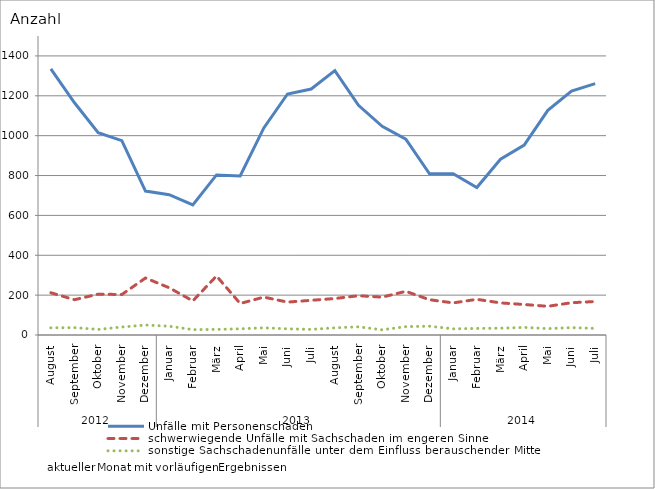
| Category | Unfälle mit Personenschaden | schwerwiegende Unfälle mit Sachschaden im engeren Sinne | sonstige Sachschadenunfälle unter dem Einfluss berauschender Mittel |
|---|---|---|---|
| 0 | 1335 | 212 | 36 |
| 1 | 1165 | 177 | 37 |
| 2 | 1015 | 205 | 28 |
| 3 | 975 | 203 | 40 |
| 4 | 722 | 286 | 50 |
| 5 | 704 | 237 | 44 |
| 6 | 653 | 171 | 27 |
| 7 | 803 | 296 | 28 |
| 8 | 798 | 158 | 31 |
| 9 | 1039 | 190 | 36 |
| 10 | 1209 | 165 | 31 |
| 11 | 1234 | 174 | 28 |
| 12 | 1326 | 183 | 36 |
| 13 | 1152 | 197 | 41 |
| 14 | 1047 | 190 | 26 |
| 15 | 983 | 219 | 42 |
| 16 | 809 | 177 | 44 |
| 17 | 809 | 161 | 31 |
| 18 | 740 | 179 | 33 |
| 19 | 882 | 161 | 34 |
| 20 | 953 | 153 | 38 |
| 21 | 1127 | 144 | 32 |
| 22 | 1224 | 162 | 37 |
| 23 | 1261 | 168 | 33 |